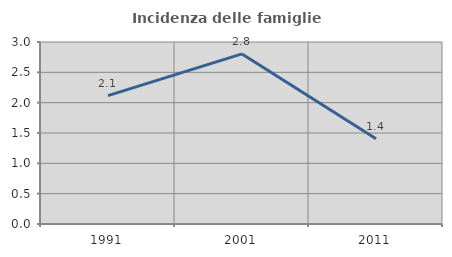
| Category | Incidenza delle famiglie numerose |
|---|---|
| 1991.0 | 2.116 |
| 2001.0 | 2.804 |
| 2011.0 | 1.404 |